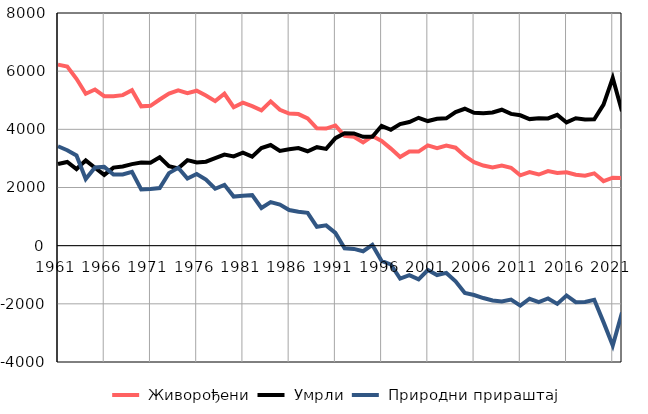
| Category |  Живорођени |  Умрли |  Природни прираштај |
|---|---|---|---|
| 1961.0 | 6226 | 2808 | 3418 |
| 1962.0 | 6159 | 2877 | 3282 |
| 1963.0 | 5738 | 2635 | 3103 |
| 1964.0 | 5223 | 2933 | 2290 |
| 1965.0 | 5368 | 2677 | 2691 |
| 1966.0 | 5140 | 2432 | 2708 |
| 1967.0 | 5134 | 2685 | 2449 |
| 1968.0 | 5176 | 2725 | 2451 |
| 1969.0 | 5343 | 2804 | 2539 |
| 1970.0 | 4790 | 2857 | 1933 |
| 1971.0 | 4807 | 2855 | 1952 |
| 1972.0 | 5025 | 3042 | 1983 |
| 1973.0 | 5227 | 2732 | 2495 |
| 1974.0 | 5339 | 2659 | 2680 |
| 1975.0 | 5247 | 2941 | 2306 |
| 1976.0 | 5327 | 2861 | 2466 |
| 1977.0 | 5163 | 2888 | 2275 |
| 1978.0 | 4968 | 3010 | 1958 |
| 1979.0 | 5223 | 3131 | 2092 |
| 1980.0 | 4760 | 3071 | 1689 |
| 1981.0 | 4915 | 3197 | 1718 |
| 1982.0 | 4796 | 3059 | 1737 |
| 1983.0 | 4652 | 3357 | 1295 |
| 1984.0 | 4961 | 3461 | 1500 |
| 1985.0 | 4673 | 3260 | 1413 |
| 1986.0 | 4541 | 3316 | 1225 |
| 1987.0 | 4524 | 3356 | 1168 |
| 1988.0 | 4376 | 3247 | 1129 |
| 1989.0 | 4035 | 3386 | 649 |
| 1990.0 | 4025 | 3327 | 698 |
| 1991.0 | 4133 | 3695 | 438 |
| 1992.0 | 3776 | 3864 | -88 |
| 1993.0 | 3745 | 3857 | -112 |
| 1994.0 | 3552 | 3743 | -191 |
| 1995.0 | 3770 | 3744 | 26 |
| 1996.0 | 3598 | 4121 | -523 |
| 1997.0 | 3337 | 3985 | -648 |
| 1998.0 | 3047 | 4181 | -1134 |
| 1999.0 | 3238 | 4252 | -1014 |
| 2000.0 | 3236 | 4397 | -1161 |
| 2001.0 | 3446 | 4285 | -839 |
| 2002.0 | 3353 | 4362 | -1009 |
| 2003.0 | 3442 | 4379 | -937 |
| 2004.0 | 3369 | 4596 | -1227 |
| 2005.0 | 3082 | 4707 | -1625 |
| 2006.0 | 2870 | 4566 | -1696 |
| 2007.0 | 2756 | 4557 | -1801 |
| 2008.0 | 2692 | 4578 | -1886 |
| 2009.0 | 2753 | 4674 | -1921 |
| 2010.0 | 2678 | 4531 | -1853 |
| 2011.0 | 2420 | 4482 | -2062 |
| 2012.0 | 2527 | 4352 | -1825 |
| 2013.0 | 2446 | 4385 | -1939 |
| 2014.0 | 2562 | 4376 | -1814 |
| 2015.0 | 2497 | 4498 | -2001 |
| 2016.0 | 2524 | 4237 | -1713 |
| 2017.0 | 2441 | 4383 | -1942 |
| 2018.0 | 2406 | 4341 | -1935 |
| 2019.0 | 2487 | 4346 | -1859 |
| 2020.0 | 2220 | 4849 | -2629 |
| 2021.0 | 2337 | 5767 | -3430 |
| 2022.0 | 2323 | 4622 | -2299 |